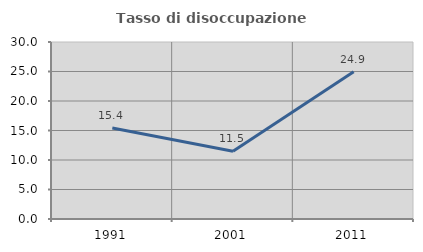
| Category | Tasso di disoccupazione giovanile  |
|---|---|
| 1991.0 | 15.417 |
| 2001.0 | 11.491 |
| 2011.0 | 24.94 |